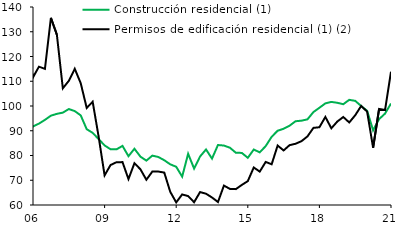
| Category | Construcción residencial (1) | Permisos de edificación residencial (1) (2) |
|---|---|---|
| 2005-03-31 | 86.206 | 93.632 |
| 2005-06-30 | 88.239 | 108.351 |
| 2005-09-30 | 88.932 | 110.845 |
| 2005-12-31 | 89.342 | 122.867 |
| 2006-03-31 | 91.736 | 111.565 |
| 2006-06-30 | 92.886 | 115.911 |
| 2006-09-30 | 94.398 | 115.013 |
| 2006-12-31 | 96.092 | 135.612 |
| 2007-03-31 | 96.827 | 128.811 |
| 2007-06-30 | 97.315 | 107.156 |
| 2007-09-30 | 98.771 | 110.151 |
| 2007-12-31 | 97.945 | 115.017 |
| 2008-03-31 | 96.203 | 109.206 |
| 2008-06-30 | 90.631 | 99.219 |
| 2008-09-30 | 89.15 | 101.721 |
| 2008-12-31 | 86.63 | 87.6 |
| 2009-03-31 | 84.072 | 71.974 |
| 2009-06-30 | 82.515 | 76.157 |
| 2009-09-30 | 82.492 | 77.294 |
| 2009-12-31 | 83.878 | 77.328 |
| 2010-03-31 | 79.723 | 70.477 |
| 2010-06-30 | 82.725 | 76.873 |
| 2010-09-30 | 79.551 | 74.446 |
| 2010-12-31 | 77.919 | 70.206 |
| 2011-03-31 | 79.955 | 73.506 |
| 2011-06-30 | 79.4 | 73.514 |
| 2011-09-30 | 78.092 | 73.098 |
| 2011-12-31 | 76.434 | 65.336 |
| 2012-03-31 | 75.444 | 61.051 |
| 2012-06-30 | 71.463 | 64.256 |
| 2012-09-30 | 80.698 | 63.611 |
| 2012-12-31 | 74.709 | 61.126 |
| 2013-03-31 | 79.6 | 65.223 |
| 2013-06-30 | 82.443 | 64.557 |
| 2013-09-30 | 78.745 | 63.037 |
| 2013-12-31 | 84.239 | 61.202 |
| 2014-03-31 | 84.015 | 67.844 |
| 2014-06-30 | 83.15 | 66.509 |
| 2014-09-30 | 81.103 | 66.411 |
| 2014-12-31 | 81.048 | 68.116 |
| 2015-03-31 | 79.067 | 69.652 |
| 2015-06-30 | 82.411 | 75.161 |
| 2015-09-30 | 81.274 | 73.491 |
| 2015-12-31 | 83.794 | 77.396 |
| 2016-03-31 | 87.565 | 76.458 |
| 2016-06-30 | 89.999 | 84.027 |
| 2016-09-30 | 90.805 | 82.038 |
| 2016-12-31 | 92.045 | 84.182 |
| 2017-03-31 | 93.845 | 84.74 |
| 2017-06-30 | 94.069 | 85.796 |
| 2017-09-30 | 94.61 | 87.715 |
| 2017-12-31 | 97.557 | 91.164 |
| 2018-03-31 | 99.284 | 91.421 |
| 2018-06-30 | 101.06 | 95.579 |
| 2018-09-30 | 101.649 | 90.992 |
| 2018-12-31 | 101.301 | 93.714 |
| 2019-03-31 | 100.721 | 95.558 |
| 2019-06-30 | 102.489 | 93.345 |
| 2019-09-30 | 102.08 | 96.258 |
| 2019-12-31 | 100 | 100 |
| 2020-03-31 | 98.058 | 97.73 |
| 2020-06-30 | 90.167 | 83.128 |
| 2020-09-30 | 94.686 | 98.776 |
| 2020-12-31 | 96.93 | 98.347 |
| 2021-03-31 | 101.008 | 113.861 |